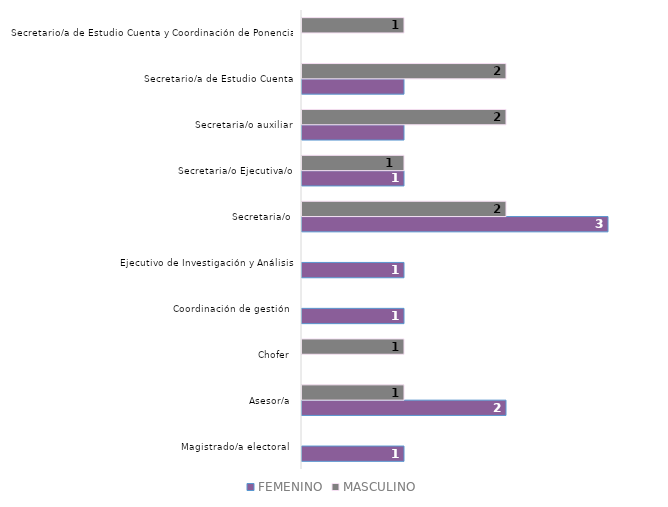
| Category | FEMENINO | MASCULINO |
|---|---|---|
| Magistrado/a electoral  | 1 | 0 |
| Asesor/a | 2 | 1 |
| Chofer | 0 | 1 |
| Coordinación de gestión  | 1 | 0 |
| Ejecutivo de Investigación y Análisis | 1 | 0 |
| Secretaria/o | 3 | 2 |
| Secretaria/o Ejecutiva/o | 1 | 1 |
| Secretaria/o auxiliar | 1 | 2 |
| Secretario/a de Estudio Cuenta | 1 | 2 |
| Secretario/a de Estudio Cuenta y Coordinación de Ponencia | 0 | 1 |